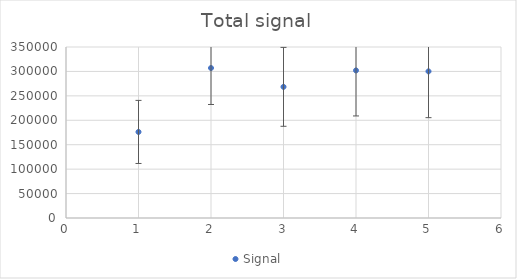
| Category | Signal |
|---|---|
| 0 | 176147.356 |
| 1 | 307000.531 |
| 2 | 268456.073 |
| 3 | 302026.627 |
| 4 | 300115.208 |